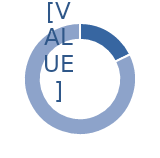
| Category | Series 0 |
|---|---|
| 0 | 0.177 |
| 1 | 0.823 |